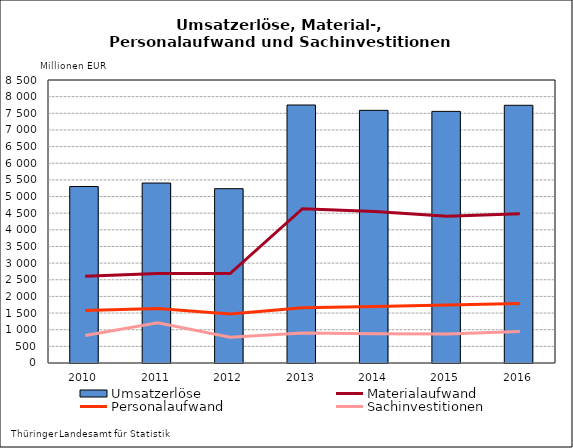
| Category | Umsatzerlöse |
|---|---|
| 2010.0 | 5301 |
| 2011.0 | 5405 |
| 2012.0 | 5236 |
| 2013.0 | 7748.836 |
| 2014.0 | 7588.59 |
| 2015.0 | 7557.268 |
| 2016.0 | 7740.227 |